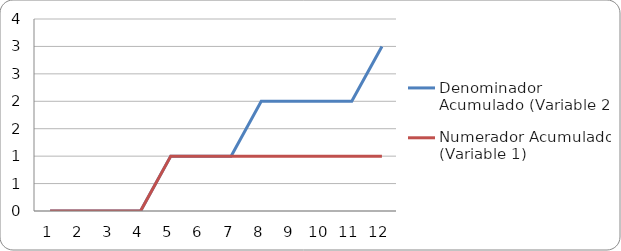
| Category | Denominador Acumulado (Variable 2) | Numerador Acumulado (Variable 1) |
|---|---|---|
| 0 | 0 | 0 |
| 1 | 0 | 0 |
| 2 | 0 | 0 |
| 3 | 0 | 0 |
| 4 | 1 | 1 |
| 5 | 1 | 1 |
| 6 | 1 | 1 |
| 7 | 2 | 1 |
| 8 | 2 | 1 |
| 9 | 2 | 1 |
| 10 | 2 | 1 |
| 11 | 3 | 1 |